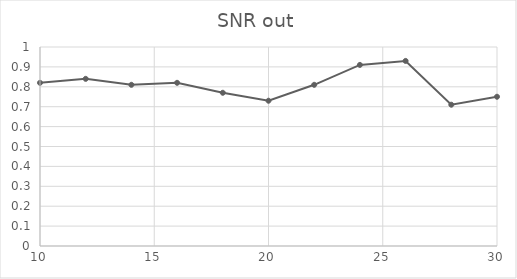
| Category | SNR out |
|---|---|
| 10.0 | 0.82 |
| 12.0 | 0.84 |
| 14.0 | 0.81 |
| 16.0 | 0.82 |
| 18.0 | 0.77 |
| 20.0 | 0.73 |
| 22.0 | 0.81 |
| 24.0 | 0.91 |
| 26.0 | 0.93 |
| 28.0 | 0.71 |
| 30.0 | 0.75 |